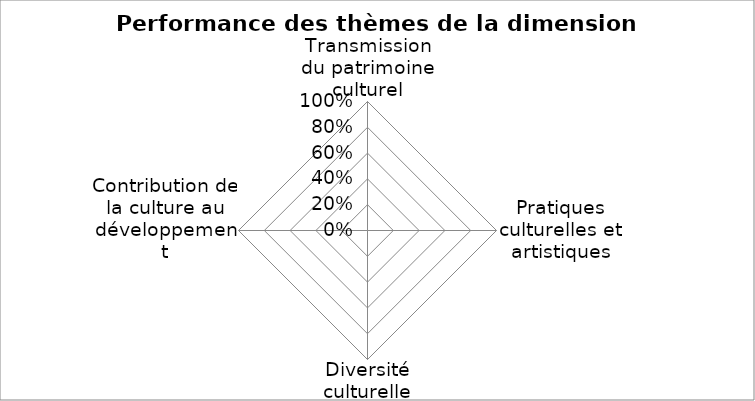
| Category | Series 0 |
|---|---|
| Transmission du patrimoine culturel | 0 |
| Pratiques culturelles et artistiques | 0 |
| Diversité culturelle | 0 |
| Contribution de la culture au développement | 0 |